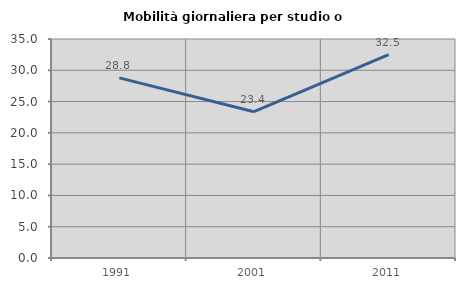
| Category | Mobilità giornaliera per studio o lavoro |
|---|---|
| 1991.0 | 28.783 |
| 2001.0 | 23.381 |
| 2011.0 | 32.5 |